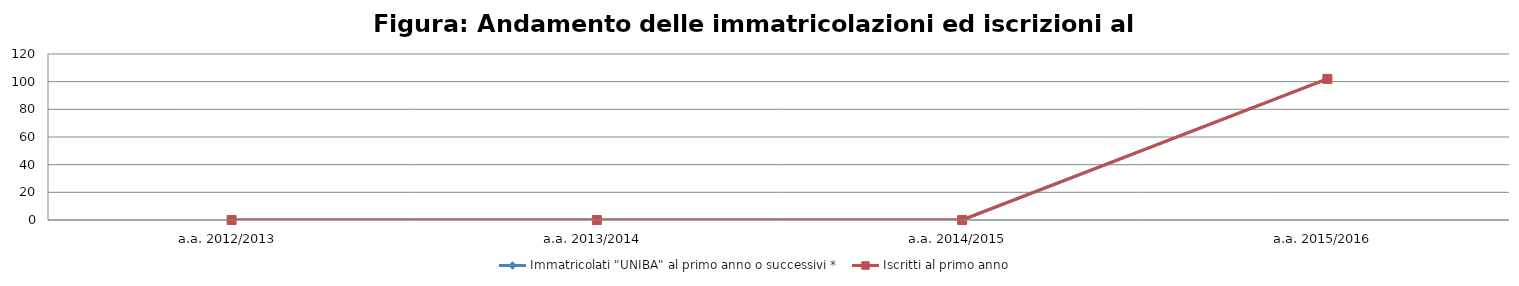
| Category | Immatricolati "UNIBA" al primo anno o successivi * | Iscritti al primo anno  |
|---|---|---|
| a.a. 2012/2013 | 0 | 0 |
| a.a. 2013/2014 | 0 | 0 |
| a.a. 2014/2015 | 0 | 0 |
| a.a. 2015/2016 | 102 | 102 |